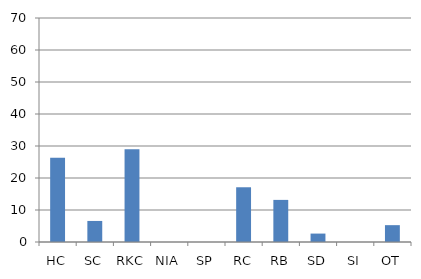
| Category | Series 0 |
|---|---|
| HC | 26.316 |
| SC | 6.579 |
| RKC | 28.947 |
| NIA | 0 |
| SP | 0 |
| RC | 17.105 |
| RB | 13.158 |
| SD | 2.632 |
| SI | 0 |
| OT | 5.263 |